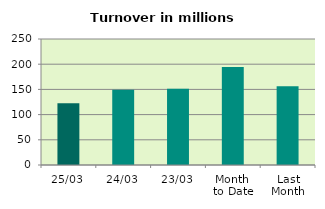
| Category | Series 0 |
|---|---|
| 25/03 | 122.5 |
| 24/03 | 149.066 |
| 23/03 | 151.051 |
| Month 
to Date | 194.469 |
| Last
Month | 156.222 |